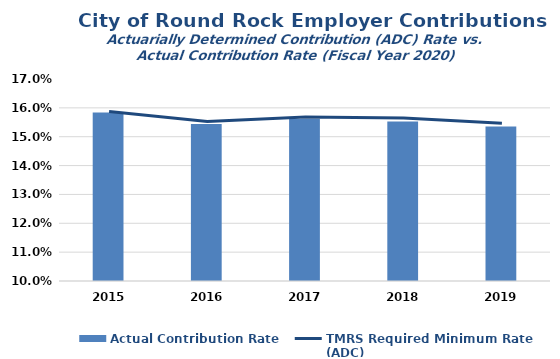
| Category | Actual Contribution Rate |
|---|---|
| 2015.0 | 0.158 |
| 2016.0 | 0.154 |
| 2017.0 | 0.156 |
| 2018.0 | 0.155 |
| 2019.0 | 0.154 |